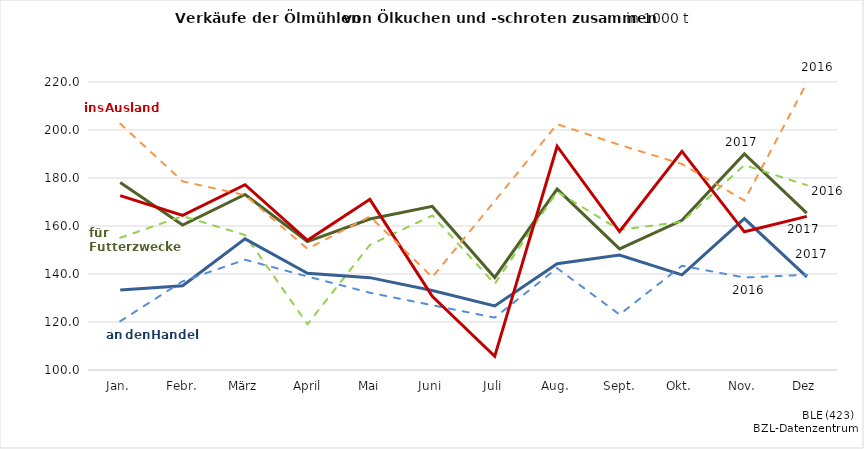
| Category | Series 0 | Series 1 | Series 2 | Series 3 | Series 4 | Series 5 |
|---|---|---|---|---|---|---|
| Jan. | 178.142 | 155.086 | 133.378 | 120.301 | 172.667 | 202.654 |
|  Febr. | 160.421 | 164.125 | 135.096 | 136.968 | 164.449 | 178.599 |
| März | 173.139 | 156.25 | 154.654 | 145.967 | 177.218 | 172.888 |
|  April | 153.526 | 119.082 | 140.276 | 138.964 | 154.058 | 150.498 |
|  Mai | 162.921 | 152.113 | 138.485 | 132.191 | 171.102 | 163.985 |
| Juni | 168.168 | 164.371 | 133.104 | 126.993 | 130.662 | 138.686 |
| Juli | 138.548 | 135.894 | 126.681 | 121.828 | 105.706 | 170.391 |
| Aug. | 175.375 | 174.333 | 144.278 | 142.429 | 193.236 | 202.435 |
|  Sept. | 150.45 | 158.366 | 147.904 | 123.099 | 157.697 | 193.789 |
| Okt. | 162.381 | 161.784 | 139.63 | 143.412 | 191.077 | 185.826 |
| Nov. | 190.002 | 185.371 | 163.075 | 138.53 | 157.571 | 170.628 |
| Dez | 165.355 | 177.009 | 138.78 | 139.666 | 164.027 | 219.614 |